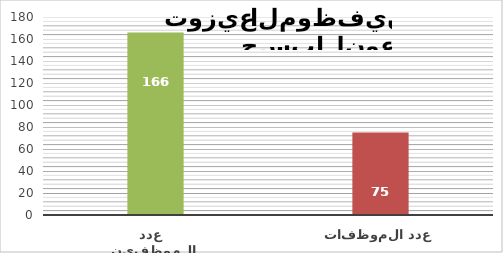
| Category | Series 1 |
|---|---|
| عدد الموظفين   | 166 |
| عدد الموظفات   | 75 |